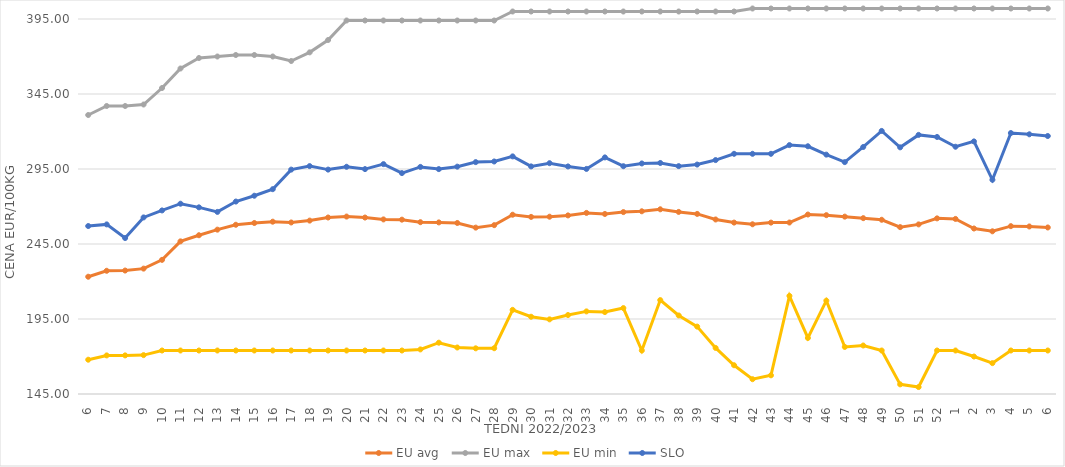
| Category | EU avg | EU max | EU min | SLO |
|---|---|---|---|---|
| 6.0 | 223.178 | 331 | 167.86 | 256.97 |
| 7.0 | 227.145 | 337 | 170.719 | 258.07 |
| 8.0 | 227.312 | 337 | 170.743 | 248.97 |
| 9.0 | 228.588 | 338 | 170.92 | 262.72 |
| 10.0 | 234.434 | 349 | 174 | 267.38 |
| 11.0 | 246.762 | 362 | 174 | 271.86 |
| 12.0 | 250.845 | 369 | 174 | 269.43 |
| 13.0 | 254.568 | 370 | 174 | 266.39 |
| 14.0 | 257.819 | 371 | 174 | 273.3 |
| 15.0 | 259 | 371 | 174 | 277.18 |
| 16.0 | 259.873 | 370 | 174 | 281.55 |
| 17.0 | 259.351 | 367 | 174 | 294.59 |
| 18.0 | 260.6 | 372.758 | 174 | 296.93 |
| 19.0 | 262.669 | 381 | 174 | 294.6 |
| 20.0 | 263.291 | 394 | 174 | 296.48 |
| 21.0 | 262.64 | 394 | 174 | 294.94 |
| 22.0 | 261.388 | 394 | 174 | 298.26 |
| 23.0 | 261.228 | 394 | 174 | 292.27 |
| 24.0 | 259.544 | 394 | 174.72 | 296.39 |
| 25.0 | 259.395 | 394 | 179.2 | 294.93 |
| 26.0 | 259.018 | 394 | 176 | 296.56 |
| 27.0 | 255.922 | 394 | 175.451 | 299.59 |
| 28.0 | 257.564 | 394 | 175.52 | 300.01 |
| 29.0 | 264.52 | 400 | 201.097 | 303.41 |
| 30.0 | 263.067 | 400 | 196.496 | 296.73 |
| 31.0 | 263.196 | 400 | 194.756 | 298.88 |
| 32.0 | 264.059 | 400 | 197.634 | 296.7 |
| 33.0 | 265.729 | 400 | 200.07 | 295.05 |
| 34.0 | 265.016 | 400 | 199.637 | 302.73 |
| 35.0 | 266.273 | 400 | 202.277 | 296.86 |
| 36.0 | 266.807 | 400 | 174 | 298.7 |
| 37.0 | 268.136 | 400 | 207.594 | 299.02 |
| 38.0 | 266.39 | 400 | 197.352 | 296.91 |
| 39.0 | 265.059 | 400 | 189.926 | 297.96 |
| 40.0 | 261.35 | 400 | 175.723 | 300.95 |
| 41.0 | 259.271 | 400 | 164.165 | 305.13 |
| 42.0 | 258.146 | 402 | 154.869 | 305.13 |
| 43.0 | 259.256 | 402 | 157.459 | 305.13 |
| 44.0 | 259.32 | 402 | 210.415 | 310.93 |
| 45.0 | 264.649 | 402 | 182.35 | 310.16 |
| 46.0 | 264.228 | 402 | 207.247 | 304.58 |
| 47.0 | 263.24 | 402 | 176.378 | 299.59 |
| 48.0 | 262.225 | 402 | 177.332 | 309.69 |
| 49.0 | 261.152 | 402 | 174 | 320.38 |
| 50.0 | 256.24 | 402 | 151.434 | 309.44 |
| 51.0 | 258.071 | 402 | 149.638 | 317.74 |
| 52.0 | 262.088 | 402 | 174 | 316.36 |
| 1.0 | 261.716 | 402 | 174 | 309.84 |
| 2.0 | 255.331 | 402 | 169.983 | 313.4 |
| 3.0 | 253.46 | 402 | 165.574 | 287.81 |
| 4.0 | 256.897 | 402 | 174 | 318.98 |
| 5.0 | 256.686 | 402 | 174 | 318.13 |
| 6.0 | 256.019 | 402 | 174 | 316.99 |